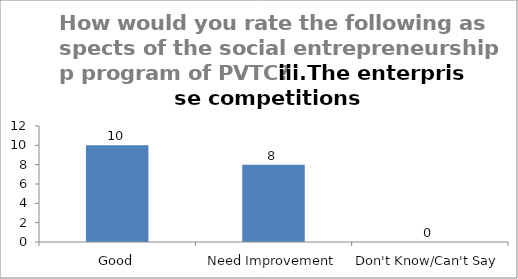
| Category | How would you rate the following aspects of the social entrepreneurship program of PVTC? iii.The enterprise competitions |
|---|---|
| Good | 10 |
| Need Improvement | 8 |
| Don't Know/Can't Say | 0 |